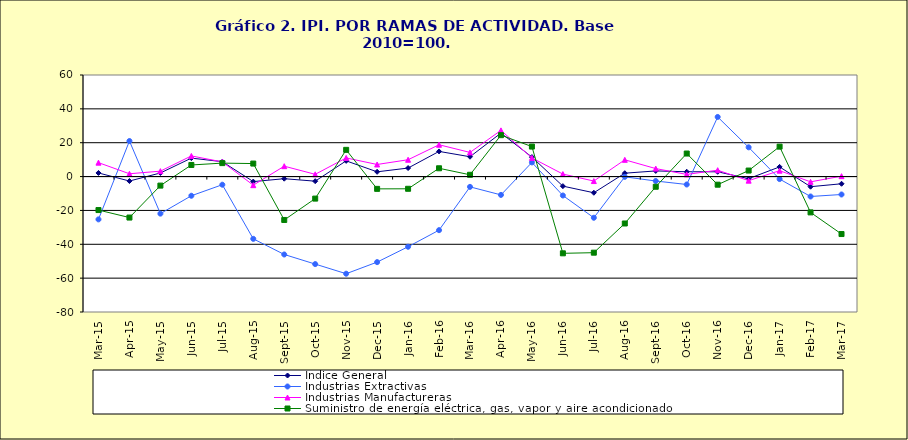
| Category | Índice General | Industrias Extractivas | Industrias Manufactureras | Suministro de energía eléctrica, gas, vapor y aire acondicionado |
|---|---|---|---|---|
| 2015-03-03 | 2.131 | -25.288 | 8.22 | -19.779 |
| 2015-04-04 | -2.63 | 21.001 | 1.659 | -24.209 |
| 2015-05-05 | 2.125 | -21.891 | 3.207 | -5.337 |
| 2015-06-06 | 10.902 | -11.334 | 12.206 | 6.846 |
| 2015-07-07 | 8.793 | -4.808 | 8.659 | 7.949 |
| 2015-08-08 | -2.962 | -36.79 | -5.077 | 7.676 |
| 2015-09-09 | -1.256 | -46.021 | 6.14 | -25.63 |
| 2015-10-10 | -2.727 | -51.697 | 1.328 | -13.016 |
| 2015-11-01 | 9.284 | -57.382 | 11.015 | 15.787 |
| 2015-12-02 | 2.805 | -50.53 | 7.149 | -7.264 |
| 2016-01-01 | 5.027 | -41.452 | 9.94 | -7.213 |
| 2016-02-02 | 14.862 | -31.659 | 18.791 | 4.905 |
| 2016-03-03 | 11.716 | -6.084 | 14.271 | 1.051 |
| 2016-04-04 | 25.706 | -10.827 | 27.293 | 24.454 |
| 2016-05-05 | 11.507 | 8.368 | 11.02 | 17.722 |
| 2016-06-06 | -5.65 | -11.184 | 1.48 | -45.341 |
| 2016-07-07 | -9.559 | -24.327 | -2.652 | -44.958 |
| 2016-08-08 | 1.995 | -0.156 | 9.894 | -27.718 |
| 2016-09-09 | 3.335 | -2.622 | 4.72 | -6.015 |
| 2016-10-10 | 2.852 | -4.681 | 1.275 | 13.603 |
| 2016-11-11 | 2.812 | 35.212 | 3.769 | -4.801 |
| 2016-12-12 | -1.223 | 17.281 | -2.406 | 3.553 |
| 2017-01-01 | 5.716 | -1.476 | 3.484 | 17.679 |
| 2017-02-02 | -5.985 | -11.767 | -3.106 | -21.161 |
| 2017-03-03 | -4.253 | -10.586 | 0.238 | -33.948 |